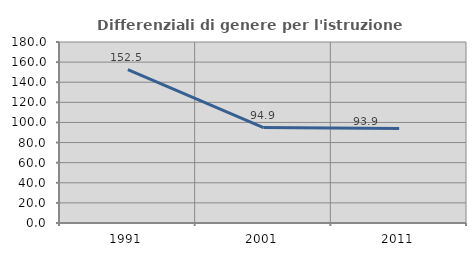
| Category | Differenziali di genere per l'istruzione superiore |
|---|---|
| 1991.0 | 152.45 |
| 2001.0 | 94.917 |
| 2011.0 | 93.929 |